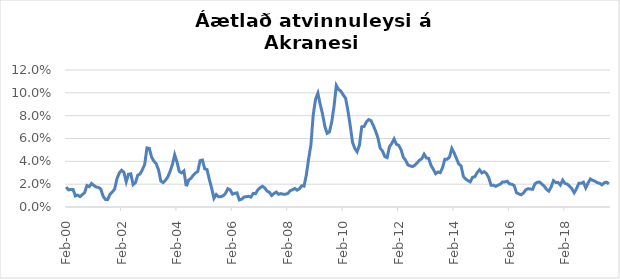
| Category | Series 0 |
|---|---|
| 2000-02-01 | 0.018 |
| 2000-03-01 | 0.015 |
| 2000-04-01 | 0.015 |
| 2000-05-01 | 0.015 |
| 2000-06-01 | 0.01 |
| 2000-07-01 | 0.01 |
| 2000-08-01 | 0.009 |
| 2000-09-01 | 0.011 |
| 2000-10-01 | 0.013 |
| 2000-11-01 | 0.019 |
| 2000-12-01 | 0.018 |
| 2001-01-01 | 0.021 |
| 2001-02-01 | 0.019 |
| 2001-03-01 | 0.017 |
| 2001-04-01 | 0.017 |
| 2001-05-01 | 0.016 |
| 2001-06-01 | 0.009 |
| 2001-07-01 | 0.007 |
| 2001-08-01 | 0.007 |
| 2001-09-01 | 0.011 |
| 2001-10-01 | 0.013 |
| 2001-11-01 | 0.016 |
| 2001-12-01 | 0.025 |
| 2002-01-01 | 0.03 |
| 2002-02-01 | 0.032 |
| 2002-03-01 | 0.03 |
| 2002-04-01 | 0.022 |
| 2002-05-01 | 0.029 |
| 2002-06-01 | 0.029 |
| 2002-07-01 | 0.02 |
| 2002-08-01 | 0.021 |
| 2002-09-01 | 0.028 |
| 2002-10-01 | 0.029 |
| 2002-11-01 | 0.033 |
| 2002-12-01 | 0.037 |
| 2003-01-01 | 0.052 |
| 2003-02-01 | 0.051 |
| 2003-03-01 | 0.044 |
| 2003-04-01 | 0.04 |
| 2003-05-01 | 0.038 |
| 2003-06-01 | 0.033 |
| 2003-07-01 | 0.023 |
| 2003-08-01 | 0.021 |
| 2003-09-01 | 0.023 |
| 2003-10-01 | 0.026 |
| 2003-11-01 | 0.031 |
| 2003-12-01 | 0.037 |
| 2004-01-01 | 0.046 |
| 2004-02-01 | 0.039 |
| 2004-03-01 | 0.031 |
| 2004-04-01 | 0.03 |
| 2004-05-01 | 0.032 |
| 2004-06-01 | 0.018 |
| 2004-07-01 | 0.024 |
| 2004-08-01 | 0.025 |
| 2004-09-01 | 0.028 |
| 2004-10-01 | 0.03 |
| 2004-11-01 | 0.031 |
| 2004-12-01 | 0.041 |
| 2005-01-01 | 0.041 |
| 2005-02-01 | 0.033 |
| 2005-03-01 | 0.033 |
| 2005-04-01 | 0.024 |
| 2005-05-01 | 0.017 |
| 2005-06-01 | 0.008 |
| 2005-07-01 | 0.011 |
| 2005-08-01 | 0.009 |
| 2005-09-01 | 0.009 |
| 2005-10-01 | 0.01 |
| 2005-11-01 | 0.012 |
| 2005-12-01 | 0.016 |
| 2006-01-01 | 0.015 |
| 2006-02-01 | 0.011 |
| 2006-03-01 | 0.012 |
| 2006-04-01 | 0.012 |
| 2006-05-01 | 0.006 |
| 2006-06-01 | 0.007 |
| 2006-07-01 | 0.009 |
| 2006-08-01 | 0.009 |
| 2006-09-01 | 0.009 |
| 2006-10-01 | 0.009 |
| 2006-11-01 | 0.012 |
| 2006-12-01 | 0.012 |
| 2007-01-01 | 0.015 |
| 2007-02-01 | 0.017 |
| 2007-03-01 | 0.018 |
| 2007-04-01 | 0.017 |
| 2007-05-01 | 0.014 |
| 2007-06-01 | 0.013 |
| 2007-07-01 | 0.01 |
| 2007-08-01 | 0.012 |
| 2007-09-01 | 0.013 |
| 2007-10-01 | 0.011 |
| 2007-11-01 | 0.012 |
| 2007-12-01 | 0.011 |
| 2008-01-01 | 0.011 |
| 2008-02-01 | 0.012 |
| 2008-03-01 | 0.014 |
| 2008-04-01 | 0.015 |
| 2008-05-01 | 0.016 |
| 2008-06-01 | 0.015 |
| 2008-07-01 | 0.016 |
| 2008-08-01 | 0.019 |
| 2008-09-01 | 0.018 |
| 2008-10-01 | 0.028 |
| 2008-11-01 | 0.042 |
| 2008-12-01 | 0.055 |
| 2009-01-01 | 0.081 |
| 2009-02-01 | 0.094 |
| 2009-03-01 | 0.1 |
| 2009-04-01 | 0.09 |
| 2009-05-01 | 0.082 |
| 2009-06-01 | 0.071 |
| 2009-07-01 | 0.065 |
| 2009-08-01 | 0.066 |
| 2009-09-01 | 0.074 |
| 2009-10-01 | 0.088 |
| 2009-11-01 | 0.106 |
| 2009-12-01 | 0.103 |
| 2010-01-01 | 0.101 |
| 2010-02-01 | 0.098 |
| 2010-03-01 | 0.095 |
| 2010-04-01 | 0.085 |
| 2010-05-01 | 0.071 |
| 2010-06-01 | 0.057 |
| 2010-07-01 | 0.051 |
| 2010-08-01 | 0.048 |
| 2010-09-01 | 0.054 |
| 2010-10-01 | 0.07 |
| 2010-11-01 | 0.071 |
| 2010-12-01 | 0.074 |
| 2011-01-01 | 0.077 |
| 2011-02-01 | 0.076 |
| 2011-03-01 | 0.071 |
| 2011-04-01 | 0.066 |
| 2011-05-01 | 0.061 |
| 2011-06-01 | 0.051 |
| 2011-07-01 | 0.049 |
| 2011-08-01 | 0.044 |
| 2011-09-01 | 0.043 |
| 2011-10-01 | 0.053 |
| 2011-11-01 | 0.056 |
| 2011-12-01 | 0.06 |
| 2012-01-01 | 0.055 |
| 2012-02-01 | 0.054 |
| 2012-03-01 | 0.05 |
| 2012-04-01 | 0.044 |
| 2012-05-01 | 0.041 |
| 2012-06-01 | 0.037 |
| 2012-07-01 | 0.036 |
| 2012-08-01 | 0.035 |
| 2012-09-01 | 0.037 |
| 2012-10-01 | 0.039 |
| 2012-11-01 | 0.041 |
| 2012-12-01 | 0.042 |
| 2013-01-01 | 0.046 |
| 2013-02-01 | 0.043 |
| 2013-03-01 | 0.043 |
| 2013-04-01 | 0.036 |
| 2013-05-01 | 0.033 |
| 2013-06-01 | 0.029 |
| 2013-07-01 | 0.031 |
| 2013-08-01 | 0.03 |
| 2013-09-01 | 0.035 |
| 2013-10-01 | 0.042 |
| 2013-11-01 | 0.042 |
| 2013-12-01 | 0.044 |
| 2014-01-01 | 0.051 |
| 2014-02-01 | 0.047 |
| 2014-03-01 | 0.043 |
| 2014-04-01 | 0.038 |
| 2014-05-01 | 0.036 |
| 2014-06-01 | 0.027 |
| 2014-07-01 | 0.024 |
| 2014-08-01 | 0.023 |
| 2014-09-01 | 0.022 |
| 2014-10-01 | 0.026 |
| 2014-11-01 | 0.027 |
| 2014-12-01 | 0.03 |
| 2015-01-01 | 0.033 |
| 2015-02-01 | 0.03 |
| 2015-03-01 | 0.031 |
| 2015-04-01 | 0.029 |
| 2015-05-01 | 0.026 |
| 2015-06-01 | 0.019 |
| 2015-07-01 | 0.019 |
| 2015-08-01 | 0.018 |
| 2015-09-01 | 0.019 |
| 2015-10-01 | 0.02 |
| 2015-11-01 | 0.022 |
| 2015-12-01 | 0.022 |
| 2016-01-01 | 0.023 |
| 2016-02-01 | 0.02 |
| 2016-03-01 | 0.02 |
| 2016-04-01 | 0.019 |
| 2016-05-01 | 0.013 |
| 2016-06-01 | 0.011 |
| 2016-07-01 | 0.011 |
| 2016-08-01 | 0.012 |
| 2016-09-01 | 0.015 |
| 2016-10-01 | 0.016 |
| 2016-11-01 | 0.016 |
| 2016-12-01 | 0.015 |
| 2017-01-01 | 0.02 |
| 2017-02-01 | 0.022 |
| 2017-03-01 | 0.022 |
| 2017-04-01 | 0.02 |
| 2017-05-01 | 0.018 |
| 2017-06-01 | 0.015 |
| 2017-07-01 | 0.014 |
| 2017-08-01 | 0.017 |
| 2017-09-01 | 0.023 |
| 2017-10-01 | 0.021 |
| 2017-11-01 | 0.021 |
| 2017-12-01 | 0.019 |
| 2018-01-01 | 0.024 |
| 2018-02-01 | 0.021 |
| 2018-03-01 | 0.02 |
| 2018-04-01 | 0.018 |
| 2018-05-01 | 0.016 |
| 2018-06-01 | 0.012 |
| 2018-07-01 | 0.016 |
| 2018-08-01 | 0.021 |
| 2018-09-01 | 0.021 |
| 2018-10-01 | 0.022 |
| 2018-11-01 | 0.017 |
| 2018-12-01 | 0.021 |
| 2019-01-01 | 0.025 |
| 2019-02-01 | 0.023 |
| 2019-03-01 | 0.023 |
| 2019-04-01 | 0.021 |
| 2019-05-01 | 0.021 |
| 2019-06-01 | 0.019 |
| 2019-07-01 | 0.021 |
| 2019-08-01 | 0.022 |
| 2019-09-01 | 0.02 |